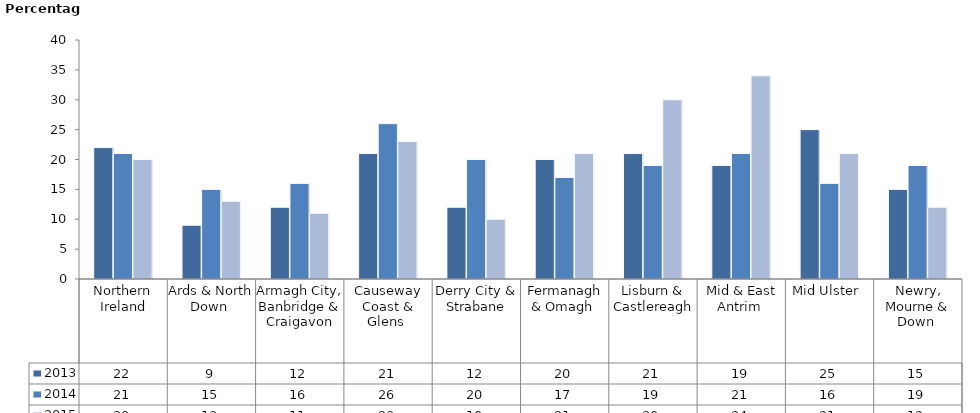
| Category | 2013 | 2014 | 2015 |
|---|---|---|---|
| Northern Ireland | 22 | 21 | 20 |
| Ards & North Down  | 9 | 15 | 13 |
| Armagh City, Banbridge & Craigavon | 12 | 16 | 11 |
| Causeway Coast & Glens  | 21 | 26 | 23 |
| Derry City & Strabane | 12 | 20 | 10 |
| Fermanagh & Omagh  | 20 | 17 | 21 |
| Lisburn & Castlereagh | 21 | 19 | 30 |
| Mid & East Antrim  | 19 | 21 | 34 |
| Mid Ulster  | 25 | 16 | 21 |
| Newry, Mourne & Down  | 15 | 19 | 12 |